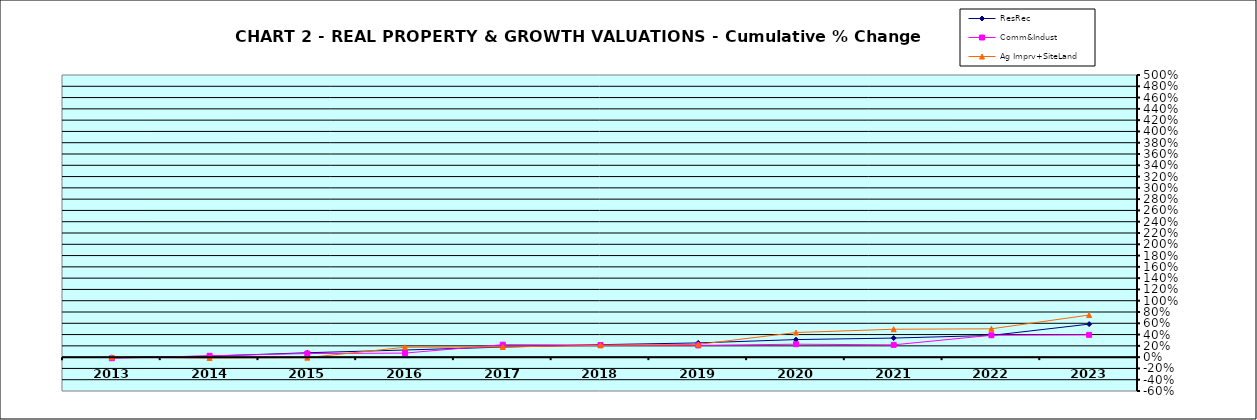
| Category | ResRec | Comm&Indust | Ag Imprv+SiteLand |
|---|---|---|---|
| 2013.0 | -0.009 | -0.02 | 0 |
| 2014.0 | 0.018 | 0.024 | -0.015 |
| 2015.0 | 0.078 | 0.064 | -0.009 |
| 2016.0 | 0.126 | 0.072 | 0.176 |
| 2017.0 | 0.178 | 0.221 | 0.18 |
| 2018.0 | 0.221 | 0.215 | 0.209 |
| 2019.0 | 0.252 | 0.208 | 0.226 |
| 2020.0 | 0.311 | 0.23 | 0.437 |
| 2021.0 | 0.338 | 0.218 | 0.495 |
| 2022.0 | 0.385 | 0.388 | 0.502 |
| 2023.0 | 0.585 | 0.395 | 0.746 |